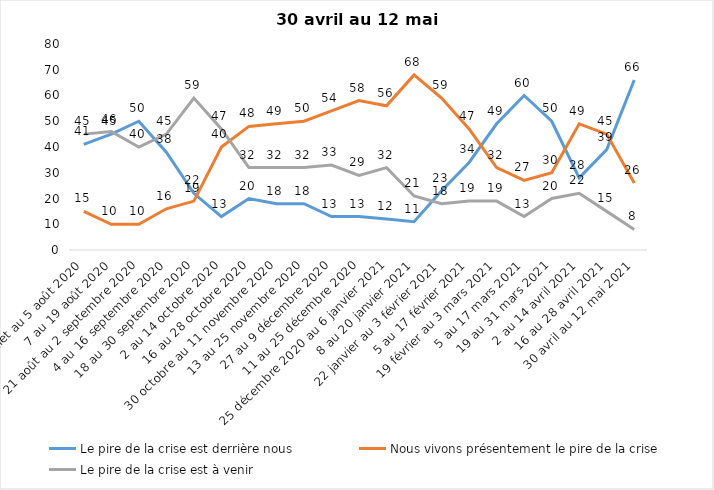
| Category | Le pire de la crise est derrière nous | Nous vivons présentement le pire de la crise | Le pire de la crise est à venir |
|---|---|---|---|
| 24 juillet au 5 août 2020 | 41 | 15 | 45 |
| 7 au 19 août 2020 | 45 | 10 | 46 |
| 21 août au 2 septembre 2020 | 50 | 10 | 40 |
| 4 au 16 septembre 2020 | 38 | 16 | 45 |
| 18 au 30 septembre 2020 | 22 | 19 | 59 |
| 2 au 14 octobre 2020 | 13 | 40 | 47 |
| 16 au 28 octobre 2020 | 20 | 48 | 32 |
| 30 octobre au 11 novembre 2020 | 18 | 49 | 32 |
| 13 au 25 novembre 2020 | 18 | 50 | 32 |
| 27 au 9 décembre 2020 | 13 | 54 | 33 |
| 11 au 25 décembre 2020 | 13 | 58 | 29 |
| 25 décembre 2020 au 6 janvier 2021 | 12 | 56 | 32 |
| 8 au 20 janvier 2021 | 11 | 68 | 21 |
| 22 janvier au 3 février 2021 | 23 | 59 | 18 |
| 5 au 17 février 2021 | 34 | 47 | 19 |
| 19 février au 3 mars 2021 | 49 | 32 | 19 |
| 5 au 17 mars 2021 | 60 | 27 | 13 |
| 19 au 31 mars 2021 | 50 | 30 | 20 |
| 2 au 14 avril 2021 | 28 | 49 | 22 |
| 16 au 28 avril 2021 | 39 | 45 | 15 |
| 30 avril au 12 mai 2021 | 66 | 26 | 8 |